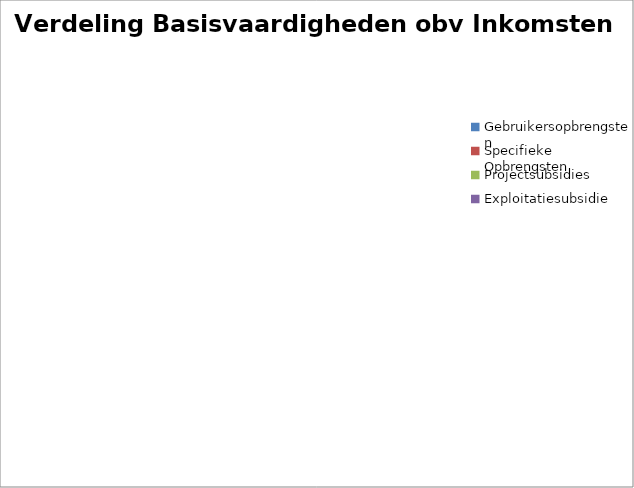
| Category | Totaal Participatie |
|---|---|
| Gebruikersopbrengsten | 0 |
| Specifieke Opbrengsten | 0 |
| Projectsubsidies | 0 |
| Exploitatiesubsidie | 0 |